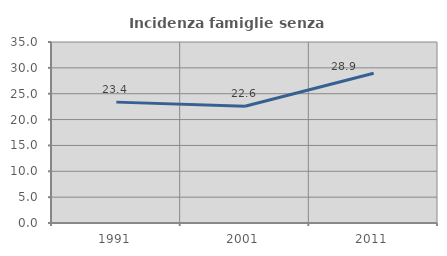
| Category | Incidenza famiglie senza nuclei |
|---|---|
| 1991.0 | 23.373 |
| 2001.0 | 22.564 |
| 2011.0 | 28.95 |